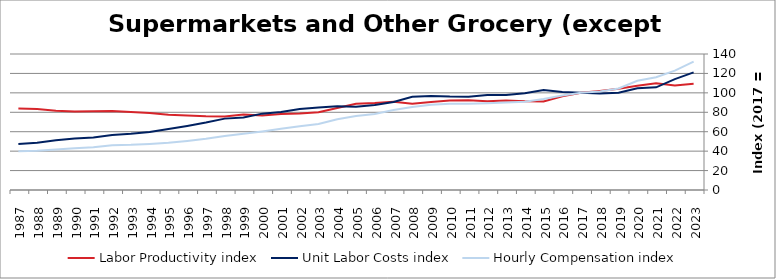
| Category | Labor Productivity index | Unit Labor Costs index | Hourly Compensation index |
|---|---|---|---|
| 2023.0 | 109.259 | 121.032 | 132.238 |
| 2022.0 | 107.616 | 114.175 | 122.87 |
| 2021.0 | 109.843 | 105.684 | 116.087 |
| 2020.0 | 107.321 | 104.729 | 112.397 |
| 2019.0 | 104.337 | 100.167 | 104.511 |
| 2018.0 | 101.955 | 99.37 | 101.312 |
| 2017.0 | 100 | 100 | 100 |
| 2016.0 | 96.467 | 100.893 | 97.328 |
| 2015.0 | 91.049 | 102.973 | 93.755 |
| 2014.0 | 91.332 | 99.543 | 90.915 |
| 2013.0 | 92.113 | 97.823 | 90.108 |
| 2012.0 | 91.321 | 97.848 | 89.356 |
| 2011.0 | 92.438 | 96.06 | 88.796 |
| 2010.0 | 92.205 | 96.156 | 88.661 |
| 2009.0 | 90.526 | 96.865 | 87.688 |
| 2008.0 | 88.91 | 96.042 | 85.391 |
| 2007.0 | 90.929 | 90.576 | 82.36 |
| 2006.0 | 89.511 | 87.436 | 78.265 |
| 2005.0 | 88.792 | 85.73 | 76.122 |
| 2004.0 | 84.431 | 86.293 | 72.858 |
| 2003.0 | 80.019 | 84.858 | 67.902 |
| 2002.0 | 78.663 | 83.325 | 65.547 |
| 2001.0 | 78.32 | 80.374 | 62.948 |
| 2000.0 | 76.691 | 78.615 | 60.291 |
| 1999.0 | 77.811 | 74.544 | 58.004 |
| 1998.0 | 75.753 | 73.473 | 55.658 |
| 1997.0 | 75.942 | 69.43 | 52.726 |
| 1996.0 | 76.581 | 65.949 | 50.505 |
| 1995.0 | 77.389 | 62.709 | 48.53 |
| 1994.0 | 79.361 | 59.599 | 47.299 |
| 1993.0 | 80.321 | 57.848 | 46.464 |
| 1992.0 | 81.439 | 56.687 | 46.165 |
| 1991.0 | 81.145 | 54.091 | 43.892 |
| 1990.0 | 80.802 | 53.095 | 42.902 |
| 1989.0 | 81.576 | 51.156 | 41.731 |
| 1988.0 | 83.327 | 48.639 | 40.529 |
| 1987.0 | 83.877 | 47.46 | 39.808 |